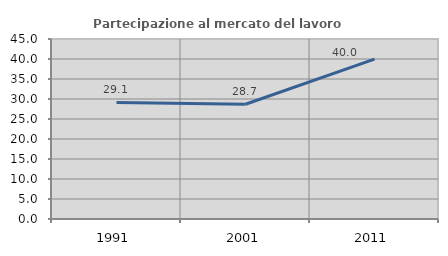
| Category | Partecipazione al mercato del lavoro  femminile |
|---|---|
| 1991.0 | 29.15 |
| 2001.0 | 28.689 |
| 2011.0 | 39.959 |